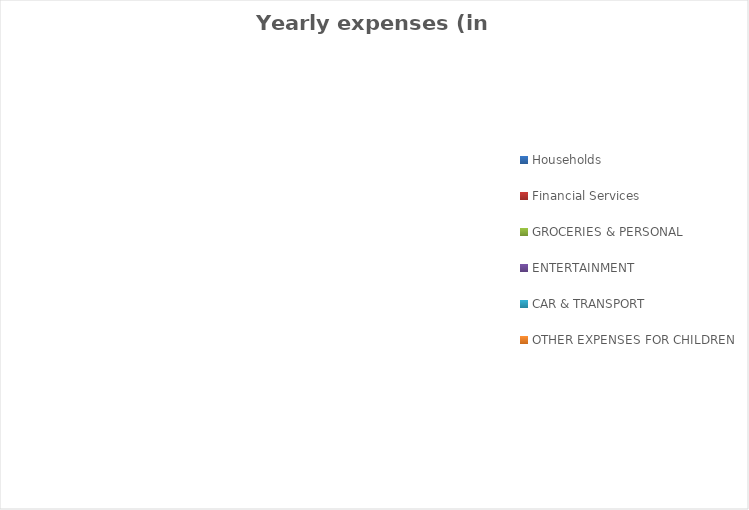
| Category | Series 0 |
|---|---|
| Households | 0 |
| Financial Services  | 0 |
| GROCERIES & PERSONAL | 0 |
| ENTERTAINMENT | 0 |
| CAR & TRANSPORT | 0 |
| OTHER EXPENSES FOR CHILDREN | 0 |